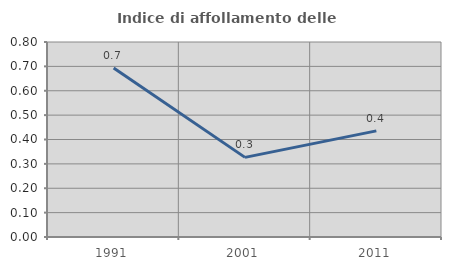
| Category | Indice di affollamento delle abitazioni  |
|---|---|
| 1991.0 | 0.694 |
| 2001.0 | 0.327 |
| 2011.0 | 0.435 |